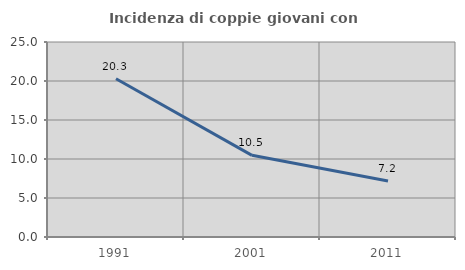
| Category | Incidenza di coppie giovani con figli |
|---|---|
| 1991.0 | 20.29 |
| 2001.0 | 10.471 |
| 2011.0 | 7.186 |